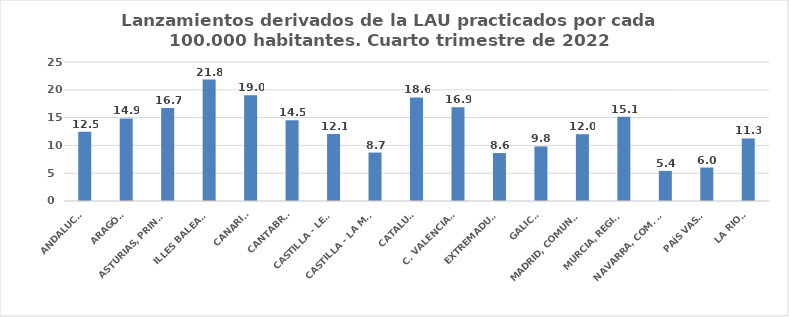
| Category | Series 0 |
|---|---|
| ANDALUCÍA | 12.459 |
| ARAGÓN | 14.853 |
| ASTURIAS, PRINCIPADO | 16.722 |
| ILLES BALEARS | 21.842 |
| CANARIAS | 19.011 |
| CANTABRIA | 14.52 |
| CASTILLA - LEÓN | 12.054 |
| CASTILLA - LA MANCHA | 8.718 |
| CATALUÑA | 18.633 |
| C. VALENCIANA | 16.869 |
| EXTREMADURA | 8.627 |
| GALICIA | 9.812 |
| MADRID, COMUNIDAD | 11.999 |
| MURCIA, REGIÓN | 15.145 |
| NAVARRA, COM. FORAL | 5.421 |
| PAÍS VASCO | 6.023 |
| LA RIOJA | 11.254 |